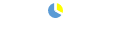
| Category | Western Med. |
|---|---|
| 0 | 17466.309 |
| 1 | 36037.4 |
| 2 | 0 |